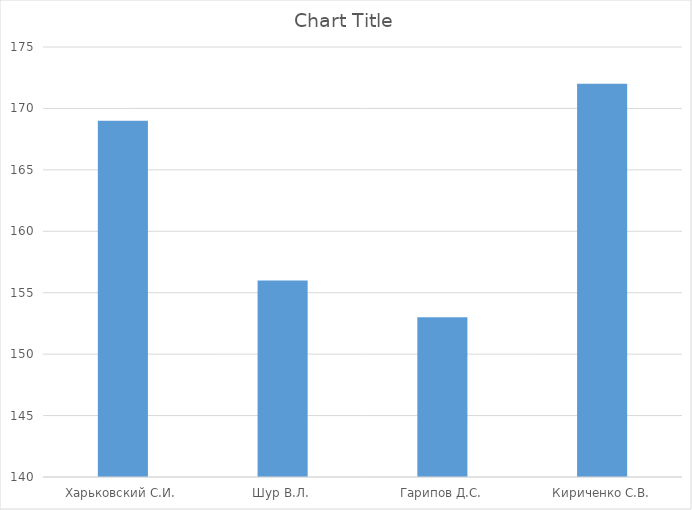
| Category | Series 0 |
|---|---|
| Харьковский С.И. | 169 |
| Шур В.Л. | 156 |
| Гарипов Д.С. | 153 |
| Кириченко С.В. | 172 |